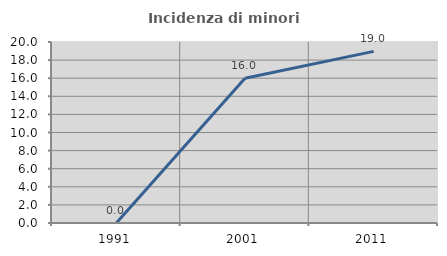
| Category | Incidenza di minori stranieri |
|---|---|
| 1991.0 | 0 |
| 2001.0 | 16 |
| 2011.0 | 18.966 |